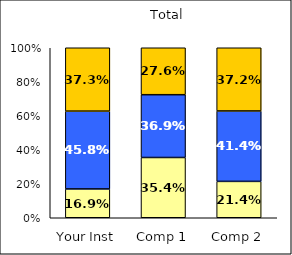
| Category | Low Institutional Priority: Commitment to Diversity | Average Institutional Priority: Commitment to Diversity | High Institutional Priority: Commitment to Diversity |
|---|---|---|---|
| Your Inst | 0.169 | 0.458 | 0.373 |
| Comp 1 | 0.354 | 0.369 | 0.276 |
| Comp 2 | 0.214 | 0.414 | 0.372 |